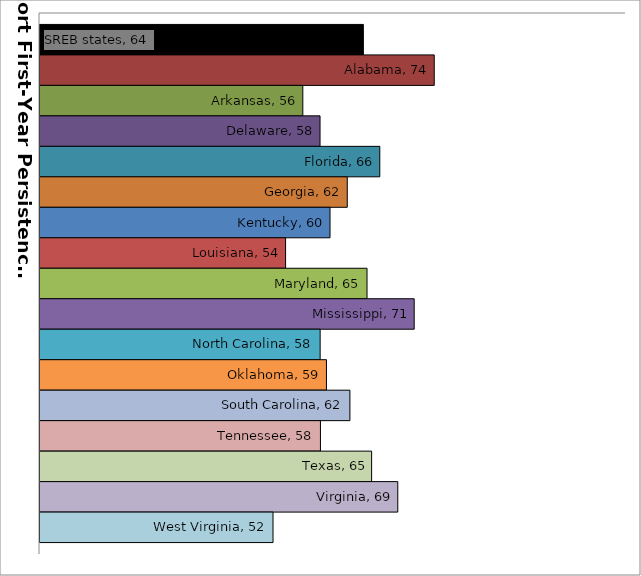
| Category | SREB states | Alabama | Arkansas | Delaware | Florida | Georgia | Kentucky | Louisiana | Maryland | Mississippi | North Carolina | Oklahoma | South Carolina | Tennessee | Texas | Virginia | West Virginia |
|---|---|---|---|---|---|---|---|---|---|---|---|---|---|---|---|---|---|
| 0 | 64.146 | 73.822 | 55.88 | 58.23 | 66.388 | 61.949 | 59.593 | 53.528 | 64.646 | 71.085 | 58.245 | 59.105 | 62.309 | 58.285 | 65.272 | 68.846 | 51.812 |